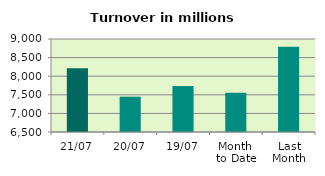
| Category | Series 0 |
|---|---|
| 21/07 | 8216.297 |
| 20/07 | 7448.7 |
| 19/07 | 7739.632 |
| Month 
to Date | 7554.942 |
| Last
Month | 8790.45 |